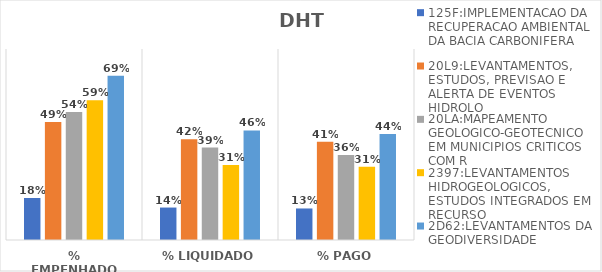
| Category | 125F:IMPLEMENTACAO DA RECUPERACAO AMBIENTAL DA BACIA CARBONIFERA | 20L9:LEVANTAMENTOS, ESTUDOS, PREVISAO E ALERTA DE EVENTOS HIDROLO | 20LA:MAPEAMENTO GEOLOGICO-GEOTECNICO EM MUNICIPIOS CRITICOS COM R | 2397:LEVANTAMENTOS HIDROGEOLOGICOS, ESTUDOS INTEGRADOS EM RECURSO | 2D62:LEVANTAMENTOS DA GEODIVERSIDADE |
|---|---|---|---|---|---|
| % EMPENHADO | 0.176 | 0.494 | 0.536 | 0.586 | 0.688 |
| % LIQUIDADO | 0.136 | 0.422 | 0.387 | 0.314 | 0.459 |
| % PAGO | 0.132 | 0.412 | 0.356 | 0.307 | 0.444 |